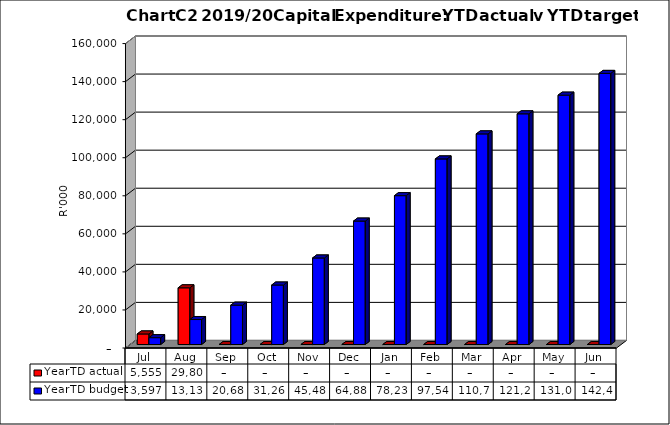
| Category | YearTD actual | YearTD budget |
|---|---|---|
| Jul | 5554740.23 | 3597000 |
| Aug | 29801091.39 | 13137000 |
| Sep | 0 | 20682000 |
| Oct | 0 | 31265000 |
| Nov | 0 | 45485000 |
| Dec | 0 | 64881000 |
| Jan | 0 | 78237000 |
| Feb | 0 | 97546000 |
| Mar | 0 | 110701000 |
| Apr | 0 | 121248000 |
| May | 0 | 131069000 |
| Jun | 0 | 142486000 |